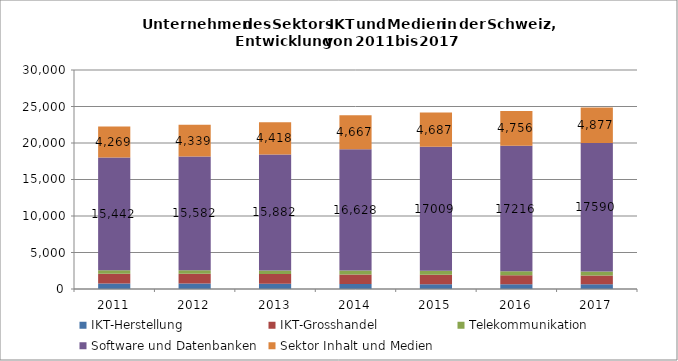
| Category | IKT-Herstellung | IKT-Grosshandel | Telekommunikation | Software und Datenbanken | Sektor Inhalt und Medien |
|---|---|---|---|---|---|
| 2011.0 | 768 | 1304 | 488 | 15442 | 4269 |
| 2012.0 | 756 | 1334 | 495 | 15582 | 4339 |
| 2013.0 | 714 | 1339 | 496 | 15882 | 4418 |
| 2014.0 | 698 | 1294 | 528 | 16628 | 4667 |
| 2015.0 | 666 | 1281 | 539 | 17009 | 4687 |
| 2016.0 | 638 | 1256 | 521 | 17216 | 4756 |
| 2017.0 | 640 | 1223 | 539 | 17590 | 4877 |